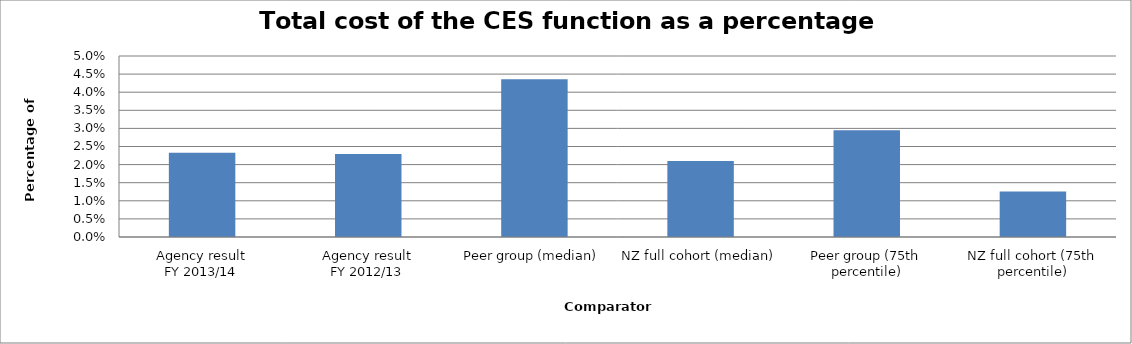
| Category | Result |
|---|---|
| Agency result
FY 2013/14 | 0.023 |
| Agency result
FY 2012/13 | 0.023 |
| Peer group (median) | 0.044 |
| NZ full cohort (median) | 0.021 |
| Peer group (75th percentile) | 0.03 |
| NZ full cohort (75th percentile) | 0.013 |